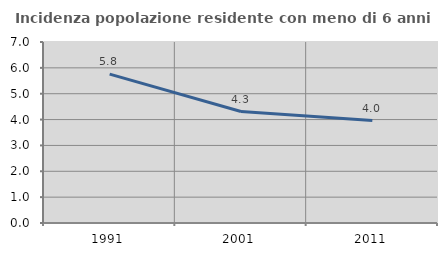
| Category | Incidenza popolazione residente con meno di 6 anni |
|---|---|
| 1991.0 | 5.758 |
| 2001.0 | 4.311 |
| 2011.0 | 3.961 |